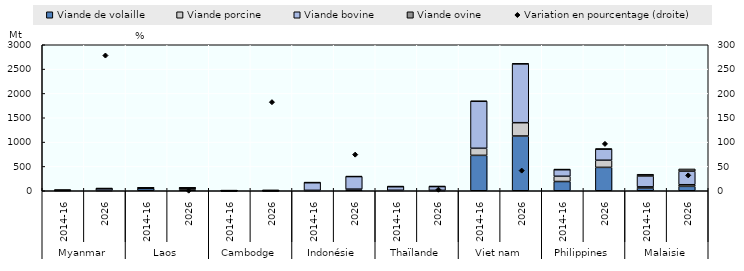
| Category | Viande de volaille | Viande porcine | Viande bovine | Viande ovine |
|---|---|---|---|---|
| 0 | 4.667 | 2.51 | 5 | 0 |
| 1 | 4.977 | 2.564 | 38.526 | 0 |
| 2 | 46.667 | 10.242 | 1.153 | 0 |
| 3 | 25.468 | 28.339 | 4.662 | 0.001 |
| 4 | 0.667 | 0.491 | 0 | 0 |
| 5 | 2.794 | 0.476 | 0.001 | 0 |
| 6 | 3.333 | 5 | 159.312 | 2.667 |
| 7 | 22.269 | 11.12 | 258.28 | 5.888 |
| 8 | 6.4 | 3.333 | 76.473 | 1.493 |
| 9 | 4.629 | 2.845 | 80.229 | 2.327 |
| 10 | 727.4 | 145.07 | 965.947 | 4.333 |
| 11 | 1124.947 | 273.619 | 1209.188 | 7.583 |
| 12 | 190 | 107.333 | 138.213 | 1.104 |
| 13 | 480.592 | 146.147 | 229.624 | 2.859 |
| 14 | 57.067 | 22.667 | 224.315 | 35.531 |
| 15 | 90.63 | 32.989 | 278.613 | 46.311 |